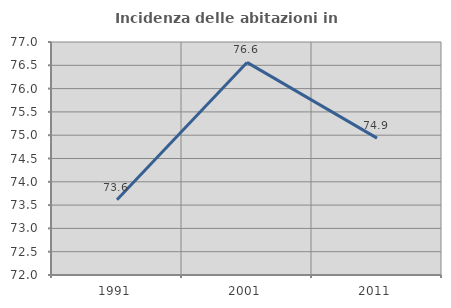
| Category | Incidenza delle abitazioni in proprietà  |
|---|---|
| 1991.0 | 73.616 |
| 2001.0 | 76.562 |
| 2011.0 | 74.937 |